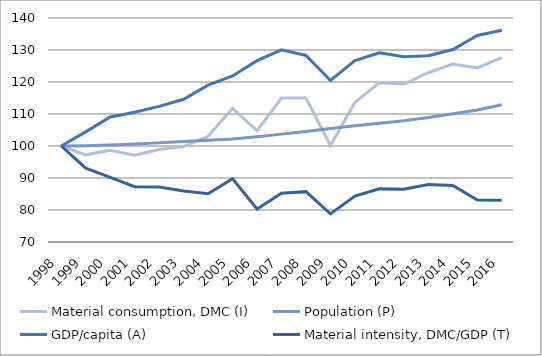
| Category | Material consumption, DMC (I) | Population (P) | GDP/capita (A) | Material intensity, DMC/GDP (T) |
|---|---|---|---|---|
| 1998.0 | 100 | 100 | 100 | 100 |
| 1999.0 | 97.24 | 100.08 | 104.407 | 93.06 |
| 2000.0 | 98.687 | 100.322 | 109.08 | 90.182 |
| 2001.0 | 97.091 | 100.619 | 110.543 | 87.291 |
| 2002.0 | 98.893 | 100.977 | 112.376 | 87.151 |
| 2003.0 | 99.827 | 101.37 | 114.597 | 85.933 |
| 2004.0 | 103.031 | 101.774 | 118.997 | 85.073 |
| 2005.0 | 111.775 | 102.185 | 121.888 | 89.742 |
| 2006.0 | 104.739 | 102.924 | 126.684 | 80.328 |
| 2007.0 | 115.004 | 103.711 | 130.054 | 85.264 |
| 2008.0 | 114.997 | 104.54 | 128.306 | 85.735 |
| 2009.0 | 100.141 | 105.493 | 120.478 | 78.792 |
| 2010.0 | 113.635 | 106.339 | 126.699 | 84.343 |
| 2011.0 | 119.79 | 107.099 | 129.155 | 86.601 |
| 2012.0 | 119.353 | 107.923 | 127.891 | 86.473 |
| 2013.0 | 122.892 | 108.928 | 128.223 | 87.987 |
| 2014.0 | 125.62 | 110.086 | 130.138 | 87.685 |
| 2015.0 | 124.39 | 111.257 | 134.554 | 83.093 |
| 2016.0 | 127.621 | 112.884 | 136.195 | 83.01 |